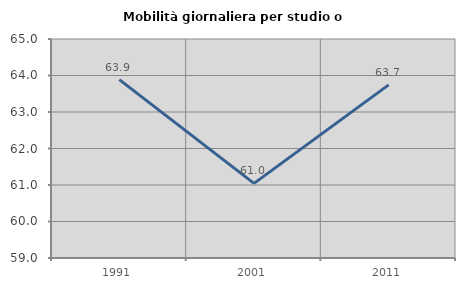
| Category | Mobilità giornaliera per studio o lavoro |
|---|---|
| 1991.0 | 63.885 |
| 2001.0 | 61.044 |
| 2011.0 | 63.743 |